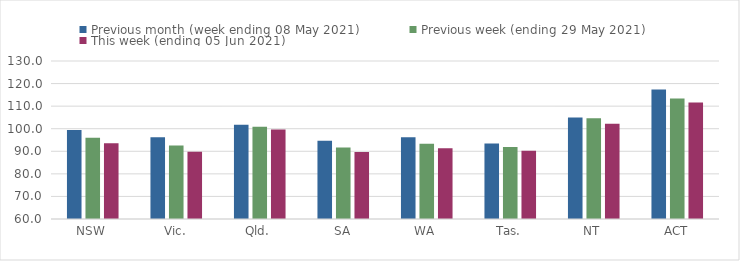
| Category | Previous month (week ending 08 May 2021) | Previous week (ending 29 May 2021) | This week (ending 05 Jun 2021) |
|---|---|---|---|
| NSW | 99.48 | 96.02 | 93.61 |
| Vic. | 96.25 | 92.61 | 89.82 |
| Qld. | 101.79 | 100.87 | 99.69 |
| SA | 94.64 | 91.68 | 89.64 |
| WA | 96.17 | 93.37 | 91.31 |
| Tas. | 93.4 | 91.93 | 90.25 |
| NT | 105 | 104.63 | 102.25 |
| ACT | 117.32 | 113.39 | 111.64 |